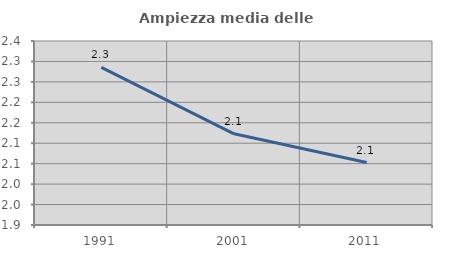
| Category | Ampiezza media delle famiglie |
|---|---|
| 1991.0 | 2.286 |
| 2001.0 | 2.123 |
| 2011.0 | 2.053 |